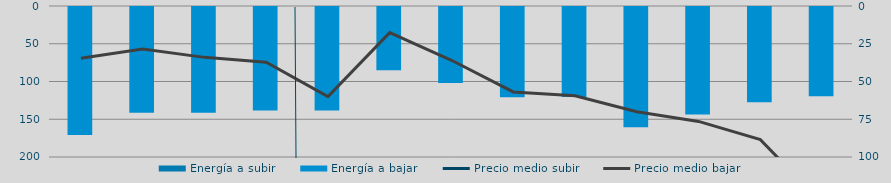
| Category | Energía a subir | Energía a bajar |
|---|---|---|
| D |  | 170.789 |
| E |  | 141.32 |
| F |  | 141.434 |
| M |  | 138.263 |
| A |  | 138.335 |
| M |  | 85.107 |
| J |  | 101.943 |
| J |  | 121.02 |
| A |  | 120.376 |
| S |  | 160.575 |
| O |  | 143.661 |
| N |  | 127.343 |
| D |  | 119.624 |